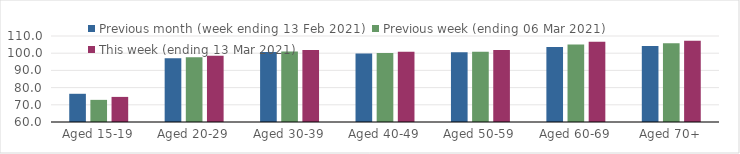
| Category | Previous month (week ending 13 Feb 2021) | Previous week (ending 06 Mar 2021) | This week (ending 13 Mar 2021) |
|---|---|---|---|
| Aged 15-19 | 76.4 | 72.87 | 74.59 |
| Aged 20-29 | 97.04 | 97.63 | 98.51 |
| Aged 30-39 | 100.72 | 101.04 | 101.79 |
| Aged 40-49 | 99.89 | 100.06 | 100.84 |
| Aged 50-59 | 100.59 | 100.84 | 101.79 |
| Aged 60-69 | 103.57 | 104.99 | 106.59 |
| Aged 70+ | 104.19 | 105.77 | 107.25 |